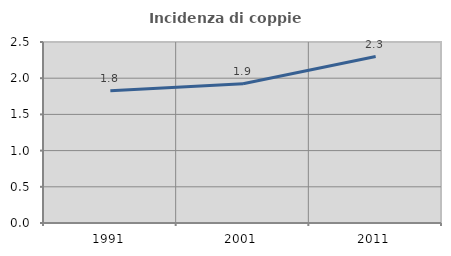
| Category | Incidenza di coppie miste |
|---|---|
| 1991.0 | 1.826 |
| 2001.0 | 1.923 |
| 2011.0 | 2.299 |